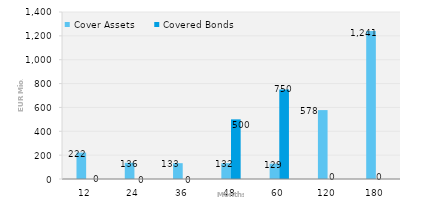
| Category | Cover Assets | Covered Bonds |
|---|---|---|
| 12.0 | 221.849 | 0 |
| 24.0 | 135.874 | 0 |
| 36.0 | 132.647 | 0 |
| 48.0 | 132.439 | 500 |
| 60.0 | 128.806 | 750 |
| 120.0 | 577.654 | 0 |
| 180.0 | 1240.817 | 0 |